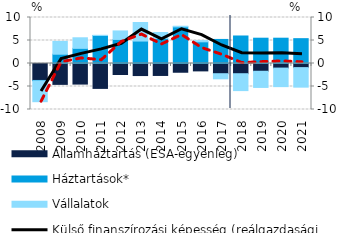
| Category | Államháztartás (ESA-egyenleg) | Háztartások* | Vállalatok |
|---|---|---|---|
| 2008.0 | -3.681 | -0.087 | -4.535 |
| 2009.0 | -4.539 | 2.02 | 2.786 |
| 2010.0 | -4.474 | 3.294 | 2.298 |
| 2011.0 | -5.414 | 6.086 | 0.042 |
| 2012.0 | -2.396 | 5.231 | 1.848 |
| 2013.0 | -2.621 | 4.878 | 4.038 |
| 2014.0 | -2.599 | 5.43 | 1.311 |
| 2015.0 | -1.902 | 7.964 | 0.134 |
| 2016.0 | -1.605 | 4.713 | 0.253 |
| 2017.0 | -2.217 | 5.232 | -1.112 |
| 2018.0 | -2.221 | 5.981 | -3.671 |
| 2019.0 | -1.689 | 5.5 | -3.514 |
| 2020.0 | -0.995 | 5.5 | -4.035 |
| 2021.0 | -0.895 | 5.4 | -4.247 |